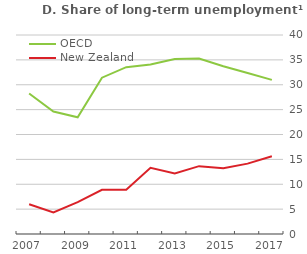
| Category | OECD |
|---|---|
| 2007.0 | 28.234 |
| 2008.0 | 24.622 |
| 2009.0 | 23.458 |
| 2010.0 | 31.421 |
| 2011.0 | 33.538 |
| 2012.0 | 34.089 |
| 2013.0 | 35.163 |
| 2014.0 | 35.269 |
| 2015.0 | 33.708 |
| 2016.0 | 32.354 |
| 2017.0 | 30.982 |